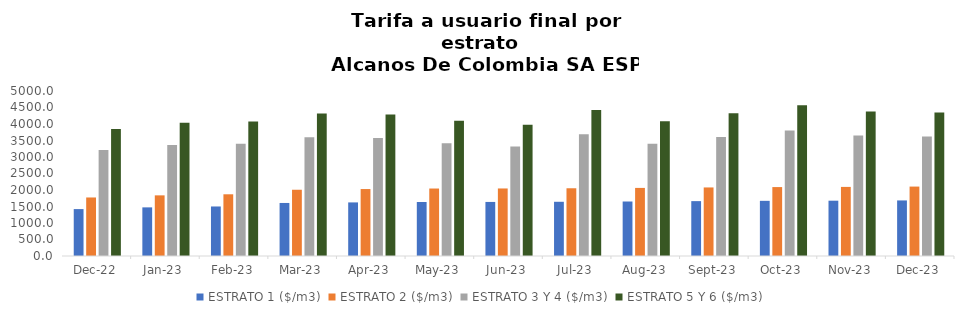
| Category | ESTRATO 1 ($/m3) | ESTRATO 2 ($/m3) | ESTRATO 3 Y 4 ($/m3) | ESTRATO 5 Y 6 ($/m3) |
|---|---|---|---|---|
| 2022-12-01 | 1421.49 | 1773.44 | 3209.93 | 3851.916 |
| 2023-01-01 | 1473.58 | 1837.63 | 3365.49 | 4038.588 |
| 2023-02-01 | 1500.78 | 1870.23 | 3398.26 | 4077.912 |
| 2023-03-01 | 1607.06 | 2007.71 | 3596.1 | 4315.32 |
| 2023-04-01 | 1623.99 | 2028.8 | 3575.22 | 4290.264 |
| 2023-05-01 | 1636.8 | 2044.82 | 3416.65 | 4099.98 |
| 2023-06-01 | 1638.29 | 2046.54 | 3316.57 | 3979.884 |
| 2023-07-01 | 1643.12 | 2052.65 | 3689.81 | 4427.772 |
| 2023-08-01 | 1651.38 | 2063.23 | 3401.48 | 4081.776 |
| 2023-09-01 | 1662.79 | 2077.45 | 3603.59 | 4324.308 |
| 2023-10-01 | 1671.74 | 2088.57 | 3805.44 | 4566.528 |
| 2023-11-01 | 1676.02 | 2093.75 | 3648.51 | 4378.212 |
| 2023-12-01 | 1683.94 | 2103.72 | 3624.28 | 4349.136 |